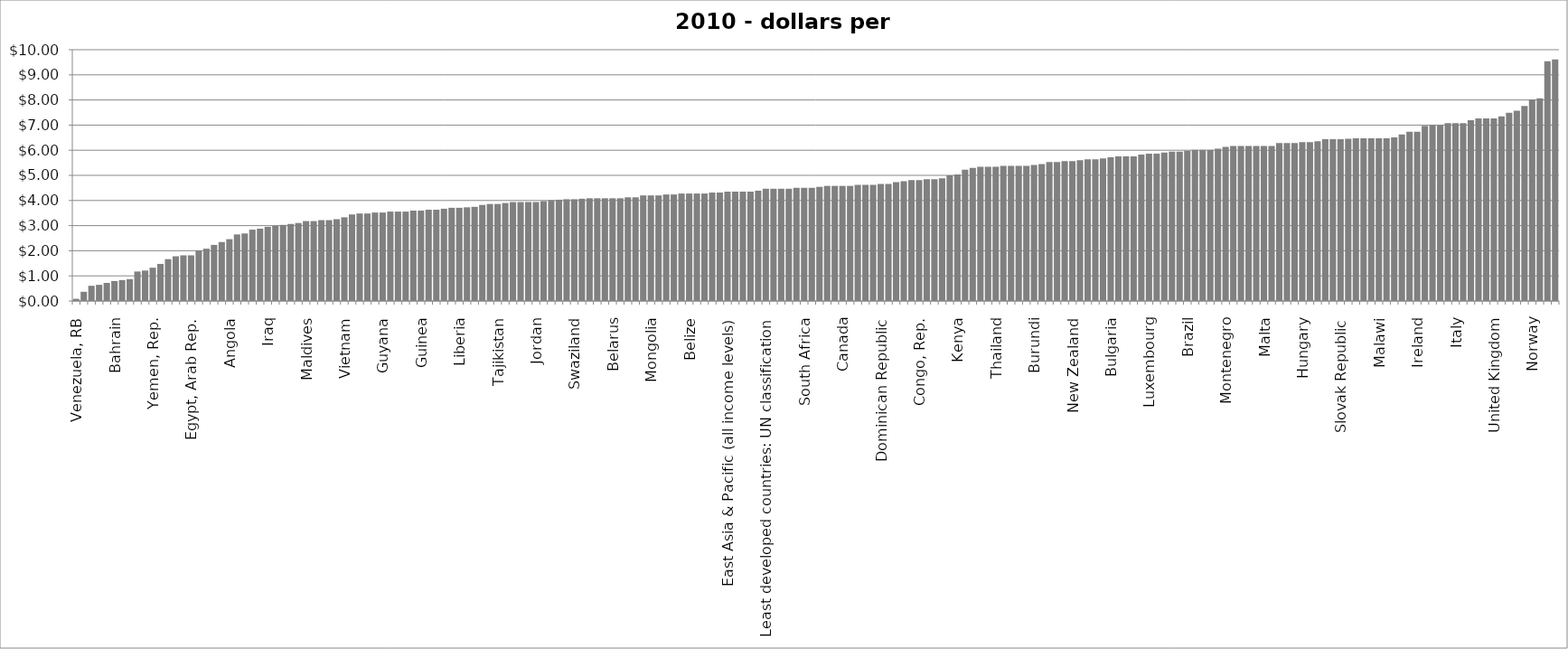
| Category | 2010 - dollars per gallon |
|---|---|
| Venezuela, RB | 0.087 |
| Iran, Islamic Rep. | 0.367 |
| Saudi Arabia | 0.606 |
| Libya | 0.644 |
| Qatar | 0.719 |
| Bahrain | 0.795 |
| Turkmenistan | 0.833 |
| Kuwait | 0.871 |
| Oman | 1.173 |
| Algeria | 1.211 |
| Yemen, Rep. | 1.325 |
| Brunei Darussalam | 1.476 |
| Nigeria | 1.666 |
| United Arab Emirates | 1.779 |
| Middle East & North Africa (all income levels) | 1.817 |
| Egypt, Arab Rep. | 1.817 |
| Ecuador | 2.006 |
| Arab World | 2.082 |
| Malaysia | 2.233 |
| Sudan | 2.347 |
| Angola | 2.461 |
| Bolivia | 2.65 |
| Kazakhstan | 2.688 |
| Azerbaijan | 2.839 |
| United States | 2.877 |
| Iraq | 2.953 |
| Indonesia | 2.99 |
| Myanmar | 3.028 |
| Mexico | 3.066 |
| Ghana | 3.104 |
| Maldives | 3.18 |
| Russian Federation | 3.18 |
| Kyrgyz Republic | 3.218 |
| Panama | 3.218 |
| Pakistan | 3.255 |
| Vietnam | 3.331 |
| Ethiopia | 3.445 |
| El Salvador | 3.483 |
| Uzbekistan | 3.483 |
| Botswana | 3.52 |
| Guyana | 3.52 |
| Middle East & North Africa (developing only) | 3.558 |
| Sierra Leone | 3.558 |
| Tunisia | 3.558 |
| Guatemala | 3.596 |
| Guinea | 3.596 |
| Argentina | 3.634 |
| Syrian Arab Republic | 3.634 |
| Lesotho | 3.672 |
| Jamaica | 3.71 |
| Liberia | 3.71 |
| North America | 3.729 |
| Antigua and Barbuda | 3.748 |
| Ukraine | 3.823 |
| Grenada | 3.861 |
| Tajikistan | 3.861 |
| Samoa | 3.899 |
| Latin America & Caribbean (developing only) | 3.937 |
| Benin | 3.937 |
| Honduras | 3.937 |
| Jordan | 3.937 |
| Philippines | 3.975 |
| Namibia | 4.013 |
| Latin America & Caribbean (all income levels) | 4.031 |
| Niger | 4.05 |
| Swaziland | 4.05 |
| Lower middle income | 4.069 |
| East Asia & Pacific (developing only) | 4.088 |
| Middle income | 4.088 |
| Armenia | 4.088 |
| Belarus | 4.088 |
| Bhutan | 4.088 |
| Bangladesh | 4.126 |
| Nicaragua | 4.126 |
| China | 4.202 |
| Mongolia | 4.202 |
| Mozambique | 4.202 |
| Low & middle income | 4.24 |
| South Asia | 4.24 |
| Upper middle income | 4.278 |
| Belize | 4.278 |
| Georgia | 4.278 |
| Lebanon | 4.278 |
| Costa Rica | 4.315 |
| Suriname | 4.315 |
| East Asia & Pacific (all income levels) | 4.353 |
| Afghanistan | 4.353 |
| Cambodia | 4.353 |
| India | 4.353 |
| Mauritania | 4.391 |
| Least developed countries: UN classification | 4.467 |
| Low income | 4.467 |
| Nepal | 4.467 |
| Togo | 4.467 |
| Heavily indebted poor countries (HIPC) | 4.505 |
| South Africa | 4.505 |
| Sri Lanka | 4.505 |
| Cameroon | 4.542 |
| Europe & Central Asia (developing only) | 4.58 |
| World | 4.58 |
| Canada | 4.58 |
| Moldova | 4.58 |
| Sub-Saharan Africa (all income levels) | 4.618 |
| Sub-Saharan Africa (developing only) | 4.618 |
| Tanzania | 4.618 |
| Dominican Republic | 4.656 |
| Morocco | 4.656 |
| Barbados | 4.732 |
| Lao PDR | 4.77 |
| Australia | 4.807 |
| Congo, Rep. | 4.807 |
| Congo, Dem. Rep. | 4.845 |
| Paraguay | 4.845 |
| Zimbabwe | 4.883 |
| Chad | 4.997 |
| Kenya | 5.035 |
| Chile | 5.224 |
| Timor-Leste | 5.3 |
| Colombia | 5.337 |
| Peru | 5.337 |
| Thailand | 5.337 |
| Bosnia and Herzegovina | 5.375 |
| Mali | 5.375 |
| Singapore | 5.375 |
| Uganda | 5.375 |
| Burundi | 5.413 |
| Burkina Faso | 5.451 |
| Albania | 5.527 |
| Romania | 5.527 |
| Cyprus | 5.565 |
| New Zealand | 5.565 |
| Latvia | 5.602 |
| Andorra | 5.64 |
| Uruguay | 5.64 |
| Serbia | 5.678 |
| Bulgaria | 5.716 |
| Korea, Rep. | 5.754 |
| Macedonia, FYR | 5.754 |
| Madagascar | 5.754 |
| Estonia | 5.83 |
| Luxembourg | 5.867 |
| Mauritius | 5.867 |
| Spain | 5.905 |
| Poland | 5.943 |
| Senegal | 5.943 |
| Brazil | 5.981 |
| Europe & Central Asia (all income levels) | 6.019 |
| Croatia | 6.019 |
| Lithuania | 6.019 |
| Japan | 6.057 |
| Montenegro | 6.132 |
| High income | 6.17 |
| Austria | 6.17 |
| Djibouti | 6.17 |
| Kosovo | 6.17 |
| Malta | 6.17 |
| Rwanda | 6.17 |
| Liechtenstein | 6.284 |
| Switzerland | 6.284 |
| Zambia | 6.284 |
| Hungary | 6.322 |
| Slovenia | 6.322 |
| Cote d'Ivoire | 6.359 |
| European Union | 6.435 |
| French Polynesia | 6.435 |
| Slovak Republic | 6.435 |
| OECD members | 6.454 |
| High income: OECD | 6.473 |
| Central African Republic | 6.473 |
| Iceland | 6.473 |
| Malawi | 6.473 |
| West Bank and Gaza | 6.473 |
| Cuba | 6.511 |
| Czech Republic | 6.624 |
| Euro area | 6.738 |
| Ireland | 6.738 |
| Cape Verde | 6.965 |
| Israel | 7.003 |
| Portugal | 7.003 |
| Belgium | 7.079 |
| Italy | 7.079 |
| Sweden | 7.079 |
| Germany | 7.192 |
| Hong Kong SAR, China | 7.268 |
| Monaco | 7.268 |
| United Kingdom | 7.268 |
| Finland | 7.344 |
| France | 7.495 |
| Denmark | 7.571 |
| Greece | 7.76 |
| Norway | 8.025 |
| Netherlands | 8.063 |
| Turkey | 9.539 |
| Eritrea | 9.615 |